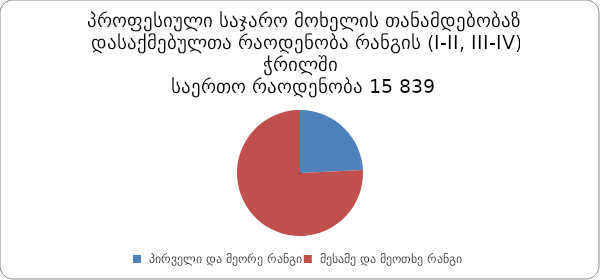
| Category | რაოდენობა |
|---|---|
|  პირველი და მეორე რანგი | 3835 |
|  მესამე და მეოთხე რანგი | 12004 |